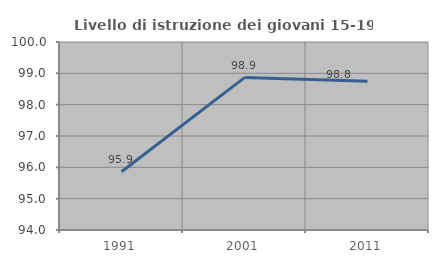
| Category | Livello di istruzione dei giovani 15-19 anni |
|---|---|
| 1991.0 | 95.858 |
| 2001.0 | 98.864 |
| 2011.0 | 98.75 |